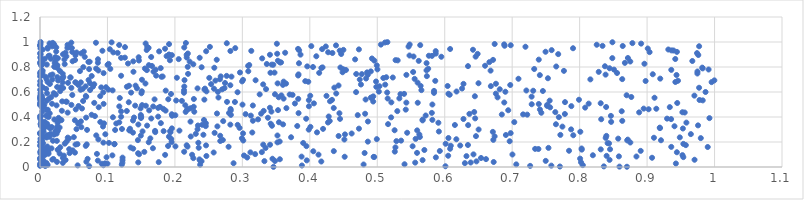
| Category | Series 0 |
|---|---|
| 0.34609850408157483 | 0.001 |
| 0.8701230169537172 | 0.002 |
| 0.8590746263405716 | 0.003 |
| 0.7707191763916836 | 0.004 |
| 0.8358766132040387 | 0.005 |
| 0.6010607535488997 | 0.006 |
| 0.07293565448946022 | 0.007 |
| 0.00771291999905519 | 0.008 |
| 0.7266412157041429 | 0.009 |
| 1.1942616296057263e-05 | 0.01 |
| 0.7580511875135892 | 0.011 |
| 0.3882707974454156 | 0.012 |
| 0.05581828898866101 | 0.013 |
| 0.09406006677202891 | 0.014 |
| 0.8047179292772505 | 0.015 |
| 0.003863088627174636 | 0.016 |
| 0.01130017151357119 | 0.017 |
| 0.23739581231754572 | 0.018 |
| 0.12126176740894952 | 0.019 |
| 0.4797131902942096 | 0.02 |
| 0.7060762783313401 | 0.021 |
| 0.5404066484481409 | 0.022 |
| 0.0018386676906438756 | 0.023 |
| 0.005142357919705772 | 0.024 |
| 9.315736753592806e-05 | 0.025 |
| 0.09159497941963071 | 0.026 |
| 0.10002402573890022 | 0.027 |
| 0.9426883934642515 | 0.028 |
| 0.09631425108684541 | 0.029 |
| 0.2869450065328188 | 0.03 |
| 0.6298747592418918 | 0.031 |
| 0.009634052700162097 | 0.032 |
| 0.03386380016610608 | 0.033 |
| 0.12213006198934043 | 0.034 |
| 0.5562227075702795 | 0.035 |
| 0.6385126634095246 | 0.036 |
| 0.14565441430545298 | 0.037 |
| 0.8020445406044975 | 0.038 |
| 0.17603440989443436 | 0.039 |
| 0.6725695168762296 | 0.04 |
| 0.02515358011730803 | 0.041 |
| 0.06872653092047736 | 0.042 |
| 0.005001000734877526 | 0.043 |
| 0.4170150238592685 | 0.044 |
| 0.6470558440749214 | 0.045 |
| 0.23948553573883455 | 0.046 |
| 0.3326801138612933 | 0.047 |
| 0.3483039852015914 | 0.048 |
| 0.749727040892972 | 0.049 |
| 0.23739669981891307 | 0.05 |
| 0.08573642790800982 | 0.051 |
| 0.0050844624076101415 | 0.052 |
| 0.39545073359539806 | 0.053 |
| 0.12232785085866753 | 0.054 |
| 0.567184083114485 | 0.055 |
| 0.03792782334064068 | 0.056 |
| 0.8443821193558733 | 0.057 |
| 0.970344363042003 | 0.058 |
| 0.018263929062364112 | 0.059 |
| 0.0002078491798121665 | 0.06 |
| 0.23637610084465102 | 0.061 |
| 0.3555779525197878 | 0.062 |
| 0.6612224107485791 | 0.063 |
| 0.019899329452830423 | 0.064 |
| 0.07061713005036262 | 0.065 |
| 0.3446542961292698 | 0.066 |
| 0.8007031547956249 | 0.067 |
| 0.0027111332217973397 | 0.068 |
| 0.0009761094461368969 | 0.069 |
| 2.217282747861245e-06 | 0.07 |
| 0.22726643992422932 | 0.071 |
| 0.6538391295614256 | 0.072 |
| 0.033878473131424405 | 0.073 |
| 0.9073660488570621 | 0.074 |
| 0.12237888075237903 | 0.075 |
| 0.30718309983009245 | 0.076 |
| 0.5868591995673863 | 0.077 |
| 0.09867170390908793 | 0.078 |
| 0.9537196063433162 | 0.079 |
| 0.4954651481825387 | 0.08 |
| 0.49463863612927106 | 0.081 |
| 0.45167173284663703 | 0.082 |
| 0.3877857817559414 | 0.083 |
| 0.8842214962436343 | 0.084 |
| 0.8581959821748041 | 0.085 |
| 0.0024866523060763225 | 0.086 |
| 0.6322340298765589 | 0.087 |
| 0.24668157246419262 | 0.088 |
| 0.8400088670649972 | 0.089 |
| 0.6051160154622663 | 0.09 |
| 0.03536148895313439 | 0.091 |
| 0.3024554383872878 | 0.092 |
| 0.10729480263548205 | 0.093 |
| 0.8196174866211832 | 0.094 |
| 0.9524343902360414 | 0.095 |
| 0.0072368965800672785 | 0.096 |
| 0.18549781271415383 | 0.097 |
| 0.2254789067246822 | 0.098 |
| 0.4128695777979794 | 0.099 |
| 0.7003798539905738 | 0.1 |
| 0.6426288253663484 | 0.101 |
| 0.14697462826221633 | 0.102 |
| 0.3189875935034514 | 0.103 |
| 0.0020687035044975855 | 0.104 |
| 0.08440831731598081 | 0.105 |
| 0.012571795168483588 | 0.106 |
| 0.0292068193292072 | 0.107 |
| 0.009062133623295516 | 0.108 |
| 0.0007167533508876055 | 0.109 |
| 0.1454113684133526 | 0.11 |
| 0.0438724239287738 | 0.111 |
| 0.4812385304832297 | 0.112 |
| 0.5589462784256256 | 0.113 |
| 0.012267878290702756 | 0.114 |
| 0.051820088517687296 | 0.115 |
| 0.25747481049224435 | 0.116 |
| 0.3119596891810316 | 0.117 |
| 0.9441618830176376 | 0.118 |
| 0.32889085168017557 | 0.119 |
| 0.0005091550194783028 | 0.12 |
| 0.1546633832366411 | 0.121 |
| 0.21371602462328368 | 0.122 |
| 0.525997482557602 | 0.123 |
| 0.009524539337488458 | 0.124 |
| 0.000889873601262781 | 0.125 |
| 0.40516804132315376 | 0.126 |
| 0.4355428114707357 | 0.127 |
| 0.5927151085216991 | 0.128 |
| 0.8905290691563017 | 0.129 |
| 0.7842803136689592 | 0.13 |
| 0.003010949885408159 | 0.131 |
| 0.011870787345475921 | 0.132 |
| 0.04845034880724805 | 0.133 |
| 0.012037415338428057 | 0.134 |
| 0.006146116607534695 | 0.135 |
| 0.5698178809231982 | 0.136 |
| 0.02631663378469189 | 0.137 |
| 0.001652901663402185 | 0.138 |
| 0.8031206051380175 | 0.139 |
| 0.027236332366496432 | 0.14 |
| 0.8313149584107221 | 0.141 |
| 0.8450949416081099 | 0.142 |
| 0.043283143471134565 | 0.143 |
| 0.7389028242029545 | 0.144 |
| 0.7340241031608948 | 0.145 |
| 0.6079969873923393 | 0.146 |
| 0.13818208685357267 | 0.147 |
| 0.8028915738352964 | 0.148 |
| 0.017077539601003233 | 0.149 |
| 0.16739616353151096 | 0.15 |
| 0.003020604731091785 | 0.151 |
| 0.3343776795671446 | 0.152 |
| 0.7537999835714145 | 0.153 |
| 0.23530548479117172 | 0.154 |
| 0.00975895863699269 | 0.155 |
| 0.13434474549654407 | 0.156 |
| 0.5269246126182355 | 0.157 |
| 0.03001518724002015 | 0.158 |
| 0.0029468920668668207 | 0.159 |
| 0.989887429713849 | 0.16 |
| 0.9358524139497696 | 0.161 |
| 0.27956423026020694 | 0.162 |
| 0.21868327953006905 | 0.163 |
| 0.011008283891728707 | 0.164 |
| 0.2007723238303978 | 0.165 |
| 0.5523963542140804 | 0.166 |
| 0.39490249344681944 | 0.167 |
| 0.18987421186689984 | 0.168 |
| 0.06786084650052786 | 0.169 |
| 0.6089907129545684 | 0.17 |
| 1.464148654706145e-05 | 0.171 |
| 0.6230002769719323 | 0.172 |
| 0.24617427616714285 | 0.173 |
| 0.2174346158828126 | 0.174 |
| 0.9574424837876597 | 0.175 |
| 0.6344037776264848 | 0.176 |
| 0.0027314434497757814 | 0.177 |
| 0.3410623511799116 | 0.178 |
| 0.33096896281635163 | 0.179 |
| 0.052660394494633535 | 0.18 |
| 0.06926060897871843 | 0.181 |
| 0.11023575705453699 | 0.182 |
| 0.055573490319121704 | 0.183 |
| 0.11049421290138632 | 0.184 |
| 0.9537584422316584 | 0.185 |
| 0.6013793258636954 | 0.186 |
| 0.03678596251341063 | 0.187 |
| 0.0015231063217676969 | 0.188 |
| 0.8436216750388169 | 0.189 |
| 0.004544852791203699 | 0.19 |
| 0.8414890374806338 | 0.191 |
| 0.3901970115116386 | 0.192 |
| 0.10216104457395644 | 0.193 |
| 0.23473445870153734 | 0.194 |
| 0.09398144210774691 | 0.195 |
| 0.875159409648524 | 0.196 |
| 0.3519900267928854 | 0.197 |
| 0.1611832608612091 | 0.198 |
| 0.19505941897767515 | 0.199 |
| 0.00022198447347669738 | 0.2 |
| 0.00307384163797535 | 0.201 |
| 0.0017536033320144817 | 0.202 |
| 0.4860000531269516 | 0.203 |
| 0.3553298145342922 | 0.204 |
| 0.039622312370843064 | 0.205 |
| 0.6962809165458379 | 0.206 |
| 0.5283522959034039 | 0.207 |
| 0.26726784861248953 | 0.208 |
| 0.024984332431647025 | 0.209 |
| 0.019164628914755517 | 0.21 |
| 0.5353355721142317 | 0.211 |
| 0.30134305658465116 | 0.212 |
| 0.8706151910249356 | 0.213 |
| 0.9206087634921669 | 0.214 |
| 0.1451440588475067 | 0.215 |
| 0.27103346544748985 | 0.216 |
| 0.6720563527396854 | 0.217 |
| 0.0031701336963966013 | 0.218 |
| 0.8713169534977834 | 0.219 |
| 0.4512435796519784 | 0.22 |
| 0.08654004582760928 | 0.221 |
| 0.6172185434925063 | 0.222 |
| 0.49932018245078363 | 0.223 |
| 0.19456774972707805 | 0.224 |
| 0.5568477748578525 | 0.225 |
| 0.0007086004685260103 | 0.226 |
| 0.8571979591816551 | 0.227 |
| 0.042868775146559235 | 0.228 |
| 0.16357235559108482 | 0.229 |
| 0.299332994543188 | 0.23 |
| 0.9796115124790612 | 0.231 |
| 0.6054807309600239 | 0.232 |
| 0.8386287802585576 | 0.233 |
| 0.910160581730461 | 0.234 |
| 0.04115666628761399 | 0.235 |
| 0.009758138327668316 | 0.236 |
| 0.9484896271221718 | 0.237 |
| 0.37223772641407626 | 0.238 |
| 0.05015876867485652 | 0.239 |
| 0.5631381363500125 | 0.24 |
| 0.014066399073711797 | 0.241 |
| 0.009598419545507334 | 0.242 |
| 0.19116727641995288 | 0.243 |
| 0.22350399835410914 | 0.244 |
| 0.673991687000459 | 0.245 |
| 0.00502068661396412 | 0.246 |
| 0.6463312001788859 | 0.247 |
| 0.4426829348365701 | 0.248 |
| 0.8396016495296093 | 0.249 |
| 0.26712197616822597 | 0.25 |
| 0.14947821458007932 | 0.251 |
| 0.3520262701853294 | 0.252 |
| 0.08341794932494594 | 0.253 |
| 0.7905731425602177 | 0.254 |
| 0.01097936709016645 | 0.255 |
| 0.6906661974335426 | 0.256 |
| 0.7714257528402756 | 0.257 |
| 0.24222493811552692 | 0.258 |
| 0.02090442577155256 | 0.259 |
| 0.5623554041738894 | 0.26 |
| 0.45209498355965994 | 0.261 |
| 0.09684790008058379 | 0.262 |
| 0.9648727745274231 | 0.263 |
| 0.0004112416076640618 | 0.264 |
| 0.23097149705830583 | 0.265 |
| 0.015610332130006392 | 0.266 |
| 0.024656368962216495 | 0.267 |
| 0.46202046513060513 | 0.268 |
| 0.30102094623632253 | 0.269 |
| 0.0007755927309659283 | 0.27 |
| 0.6977672042211963 | 0.271 |
| 5.5858426602499385e-05 | 0.272 |
| 0.2588486989551675 | 0.273 |
| 0.5443051893748219 | 0.274 |
| 0.13783575670896575 | 0.275 |
| 0.3147014083282587 | 0.276 |
| 0.41065268297629925 | 0.277 |
| 0.19347331483568994 | 0.278 |
| 0.17084621986100287 | 0.279 |
| 0.02459849242481436 | 0.28 |
| 0.671330048879794 | 0.281 |
| 0.8010230268304595 | 0.282 |
| 0.005347456244570323 | 0.283 |
| 0.5913165928157248 | 0.284 |
| 0.15204522771267823 | 0.285 |
| 0.022652676772864245 | 0.286 |
| 0.1832968909260748 | 0.287 |
| 0.19298211021650635 | 0.288 |
| 0.17055251760561219 | 0.289 |
| 0.026576107139603865 | 0.29 |
| 0.20670498400529524 | 0.291 |
| 0.1329308133586653 | 0.292 |
| 0.5591688973420827 | 0.293 |
| 0.5256878622288561 | 0.294 |
| 0.13236763589643938 | 0.295 |
| 0.11136424609788886 | 0.296 |
| 0.06976888565529421 | 0.297 |
| 0.003950693259211389 | 0.298 |
| 0.39839261486381977 | 0.299 |
| 0.6502602798090451 | 0.3 |
| 0.787375008907539 | 0.301 |
| 0.23357101044235004 | 0.302 |
| 0.05408020884572965 | 0.303 |
| 0.12150156766089905 | 0.304 |
| 0.41962603825177225 | 0.305 |
| 0.13340801508576386 | 0.306 |
| 0.4728472874970122 | 0.307 |
| 0.9530804143953012 | 0.308 |
| 0.19552779398953307 | 0.309 |
| 0.014865908388145048 | 0.31 |
| 0.9191456835399817 | 0.311 |
| 0.005820850066488295 | 0.312 |
| 0.295815657141978 | 0.313 |
| 0.015746149071602992 | 0.314 |
| 0.9187720118422132 | 0.315 |
| 0.02908479164740589 | 0.316 |
| 0.0067748014492864305 | 0.317 |
| 0.02480333065957342 | 0.318 |
| 0.06127245786417292 | 0.319 |
| 0.017142158121418172 | 0.32 |
| 0.40093364981056795 | 0.321 |
| 0.012598667547227315 | 0.322 |
| 0.774454342836116 | 0.323 |
| 0.09337631726295957 | 0.324 |
| 0.2629918719152651 | 0.325 |
| 0.9406164725016677 | 0.326 |
| 0.24571139550957463 | 0.327 |
| 0.3813792342354057 | 0.328 |
| 0.0013160730642777316 | 0.329 |
| 0.3438896028361963 | 0.33 |
| 0.15880211690300475 | 0.331 |
| 0.23412435147880165 | 0.332 |
| 0.975520917876621 | 0.333 |
| 0.002822990302092179 | 0.334 |
| 0.6347090782841476 | 0.335 |
| 0.6150744698368191 | 0.336 |
| 0.29300821399314386 | 0.337 |
| 0.24045961892165385 | 0.338 |
| 0.28216065725580575 | 0.339 |
| 0.14576808091149934 | 0.34 |
| 0.360350759661091 | 0.341 |
| 0.7648822292267519 | 0.342 |
| 0.5159975713699013 | 0.343 |
| 0.0007776602550131516 | 0.344 |
| 0.01063822118059167 | 0.345 |
| 0.34205041978566897 | 0.346 |
| 0.05658384981588535 | 0.347 |
| 0.1130863061271067 | 0.348 |
| 0.09492574469343577 | 0.349 |
| 0.24593497640420556 | 0.35 |
| 0.17915649936023206 | 0.351 |
| 0.057349405964428654 | 0.352 |
| 0.026088680789117576 | 0.353 |
| 0.5905751248688176 | 0.354 |
| 0.9582797693857213 | 0.355 |
| 0.42695229209436464 | 0.356 |
| 0.11751569704687899 | 0.357 |
| 0.3542040448153611 | 0.358 |
| 0.703115485243932 | 0.359 |
| 0.08939237719586854 | 0.36 |
| 0.8467323353988893 | 0.361 |
| 0.006998284140220014 | 0.362 |
| 0.22312987643144983 | 0.363 |
| 0.48612811304198533 | 0.364 |
| 0.06063066595191476 | 0.365 |
| 0.0016752367119302377 | 0.366 |
| 0.27161236020284957 | 0.367 |
| 0.4294887631167065 | 0.368 |
| 0.8631950204182515 | 0.369 |
| 0.3156149189558541 | 0.37 |
| 0.025759308753822336 | 0.371 |
| 0.13787646890397273 | 0.372 |
| 0.5671658009886011 | 0.373 |
| 0.05173561997182909 | 0.374 |
| 0.0317826019513538 | 0.375 |
| 0.2431080849833922 | 0.376 |
| 0.581636847684222 | 0.377 |
| 0.03013855689331374 | 0.378 |
| 0.5672603072678 | 0.379 |
| 0.02126276322527 | 0.38 |
| 0.32327337083081475 | 0.381 |
| 0.8319874578240807 | 0.382 |
| 0.9356037292439521 | 0.383 |
| 0.6278051489209643 | 0.384 |
| 0.4448051486278761 | 0.385 |
| 0.39462686890583865 | 0.386 |
| 0.9296053744177276 | 0.387 |
| 0.16494432077222024 | 0.388 |
| 0.6451523864364053 | 0.389 |
| 0.00027671579202603506 | 0.39 |
| 0.992441598070824 | 0.391 |
| 0.1497460230772881 | 0.392 |
| 0.027668554536989725 | 0.393 |
| 0.337899618780583 | 0.394 |
| 0.0683875027241188 | 0.395 |
| 0.1393850430265561 | 0.396 |
| 0.5205648061704106 | 0.397 |
| 0.10810045807617684 | 0.398 |
| 0.769191767618975 | 0.399 |
| 0.012675961593519865 | 0.4 |
| 0.15000054563110216 | 0.401 |
| 0.12024867858515169 | 0.402 |
| 0.17519056933902186 | 0.403 |
| 0.42801090419131904 | 0.404 |
| 0.010505702629349915 | 0.405 |
| 2.598601601968229e-05 | 0.406 |
| 0.08146873166276071 | 0.407 |
| 0.0016433888676747048 | 0.408 |
| 0.8463654880840058 | 0.409 |
| 0.19584393565482985 | 0.41 |
| 0.31255510625608374 | 0.411 |
| 0.5717793276111011 | 0.412 |
| 0.009314112818869857 | 0.413 |
| 0.20066031373545556 | 0.414 |
| 0.4710516543263786 | 0.415 |
| 0.14945013747121785 | 0.416 |
| 0.2829485304920725 | 0.417 |
| 0.07653423459286134 | 0.418 |
| 0.722316462866826 | 0.419 |
| 0.6846248388910127 | 0.42 |
| 0.7161870463560194 | 0.421 |
| 0.19536250232195934 | 0.422 |
| 0.30479388296115517 | 0.423 |
| 0.7781099894493159 | 0.424 |
| 0.6366029797944464 | 0.425 |
| 0.481965598719871 | 0.426 |
| 0.3278257897822405 | 0.427 |
| 0.26237443322348786 | 0.428 |
| 0.014414256677011999 | 0.429 |
| 0.44388773378754964 | 0.43 |
| 0.3833291374728593 | 0.431 |
| 0.28029498180940815 | 0.432 |
| 0.5808922484250152 | 0.433 |
| 0.7431848736744976 | 0.434 |
| 0.04098300151926024 | 0.435 |
| 0.955764747499725 | 0.436 |
| 0.8882453691052614 | 0.437 |
| 0.952313781813746 | 0.438 |
| 0.7639240917627907 | 0.439 |
| 0.6436989460834228 | 0.44 |
| 0.2159588554745163 | 0.441 |
| 0.22868754023642324 | 0.442 |
| 0.34306186148145607 | 0.443 |
| 0.0033201320813018723 | 0.444 |
| 0.12026230275294511 | 0.445 |
| 0.8623750458316373 | 0.446 |
| 0.5297052966562624 | 0.447 |
| 0.1286911761059658 | 0.448 |
| 0.3316094850480762 | 0.449 |
| 0.03240961118830298 | 0.45 |
| 0.1862033970893037 | 0.451 |
| 0.28275942828993694 | 0.452 |
| 0.161855959292946 | 0.453 |
| 0.6941250472396868 | 0.454 |
| 0.3528889545352061 | 0.455 |
| 0.009879291315666668 | 0.456 |
| 0.21784789755531098 | 0.457 |
| 0.011529253661118876 | 0.458 |
| 0.5422103318203301 | 0.459 |
| 0.7411019084324727 | 0.46 |
| 0.05304336021399901 | 0.461 |
| 0.9022854711007491 | 0.462 |
| 0.21959907760765318 | 0.463 |
| 0.2825607894132018 | 0.464 |
| 0.1828065840543102 | 0.465 |
| 0.9136806761927413 | 0.466 |
| 0.8949597590752798 | 0.467 |
| 0.06225346958118792 | 0.468 |
| 0.14907853450567915 | 0.469 |
| 0.22315933631599402 | 0.47 |
| 0.3652866046067013 | 0.471 |
| 0.43548134302499836 | 0.472 |
| 0.17504579545332116 | 0.473 |
| 0.3408353101775373 | 0.474 |
| 0.8082109754070734 | 0.475 |
| 0.0029915857214157853 | 0.476 |
| 0.7562895727698283 | 0.477 |
| 0.08709464919225499 | 0.478 |
| 0.9336513186058671 | 0.479 |
| 0.8392970013200978 | 0.48 |
| 0.17783160605159629 | 0.481 |
| 0.22789654570604373 | 0.482 |
| 0.005768461218012564 | 0.483 |
| 0.16784316711435418 | 0.484 |
| 0.11758055516842768 | 0.485 |
| 0.3986802895040067 | 0.486 |
| 0.7876970385047161 | 0.487 |
| 0.057124746373637604 | 0.488 |
| 0.7517206031361439 | 0.489 |
| 0.15691998126210288 | 0.49 |
| 0.14112952876465534 | 0.491 |
| 0.3155255284035422 | 0.492 |
| 0.024552733965341605 | 0.493 |
| 0.21539109160533534 | 0.494 |
| 0.15132842421915596 | 0.495 |
| 2.2938632300271076e-06 | 0.496 |
| 0.04656985675447961 | 0.497 |
| 0.7521069541546321 | 0.498 |
| 0.30019991451475203 | 0.499 |
| 0.5816742948871233 | 0.5 |
| 0.00654252501142814 | 0.501 |
| 0.7289691583671674 | 0.502 |
| 0.0038592139297690354 | 0.503 |
| 0.7394164589496496 | 0.504 |
| 0.09428740799721375 | 0.505 |
| 0.017779490505910794 | 0.506 |
| 0.8133927504911799 | 0.507 |
| 0.37790873350055687 | 0.508 |
| 0.40605887227683296 | 0.509 |
| 0.8312362768842158 | 0.51 |
| 3.8198102066766594e-05 | 0.511 |
| 0.9446935362389339 | 0.512 |
| 0.08040699116536604 | 0.513 |
| 0.5599963760106395 | 0.514 |
| 0.5431112501568335 | 0.515 |
| 0.6882626693457725 | 0.516 |
| 0.5208510862203467 | 0.517 |
| 0.13158731114658476 | 0.518 |
| 0.7783227618614762 | 0.519 |
| 0.28896793823742617 | 0.52 |
| 0.2772484431001666 | 0.521 |
| 0.03956407004118656 | 0.522 |
| 0.038626677266121574 | 0.523 |
| 0.493985979139989 | 0.524 |
| 0.03288714094043781 | 0.525 |
| 0.42995323748010816 | 0.526 |
| 0.001694178399432503 | 0.527 |
| 0.06391058690423641 | 0.528 |
| 0.21037696219703145 | 0.529 |
| 0.009865650011558657 | 0.53 |
| 0.7555855769059507 | 0.531 |
| 0.20186307549601112 | 0.532 |
| 0.9824749362564464 | 0.533 |
| 0.0003849319749205124 | 0.534 |
| 0.39854969302244286 | 0.535 |
| 0.9777490730738875 | 0.536 |
| 0.43287721110198213 | 0.537 |
| 0.7989906659329897 | 0.538 |
| 0.2436512549755009 | 0.539 |
| 0.48272098062971885 | 0.54 |
| 0.16984758617123366 | 0.541 |
| 0.19018159867738005 | 0.542 |
| 0.00396046292899245 | 0.543 |
| 0.22808366282482148 | 0.544 |
| 0.3828143277095334 | 0.545 |
| 0.013246303085096289 | 0.546 |
| 0.36111930147286486 | 0.547 |
| 0.5154034600624807 | 0.548 |
| 0.5327488928111477 | 0.549 |
| 0.00020774054171599356 | 0.55 |
| 0.00017687278119891966 | 0.551 |
| 0.11827013202323843 | 0.552 |
| 0.4916770286990234 | 0.553 |
| 0.911009669371061 | 0.554 |
| 0.4904241685664868 | 0.555 |
| 0.26456431206580405 | 0.556 |
| 0.6783580239076032 | 0.557 |
| 0.35385470463287905 | 0.558 |
| 0.01662781057284491 | 0.559 |
| 0.8766030604148927 | 0.56 |
| 0.0002100873979154269 | 0.561 |
| 0.06857585511204697 | 0.562 |
| 0.7288281738927059 | 0.563 |
| 0.00323879829097526 | 0.564 |
| 0.4940815323246945 | 0.565 |
| 0.6446963111684835 | 0.566 |
| 0.08929874079500077 | 0.567 |
| 0.06794444412418993 | 0.568 |
| 0.42472506877279137 | 0.569 |
| 0.40062741062634893 | 0.57 |
| 0.970134999346753 | 0.571 |
| 0.0006734948904758887 | 0.572 |
| 0.35785770731034183 | 0.573 |
| 0.869647975354691 | 0.574 |
| 0.0011687396979471693 | 0.575 |
| 0.047884938510550916 | 0.576 |
| 0.3743852767794316 | 0.577 |
| 0.6073876095962418 | 0.578 |
| 0.023384809844054114 | 0.579 |
| 0.37013387091119976 | 0.58 |
| 0.3256779254970464 | 0.581 |
| 0.34833879772729165 | 0.582 |
| 0.5343592073853994 | 0.583 |
| 0.19421814920266592 | 0.584 |
| 0.5397696541800482 | 0.585 |
| 0.6054989881259437 | 0.586 |
| 0.6758062923793181 | 0.587 |
| 0.4391961308918188 | 0.588 |
| 0.010472956074096661 | 0.589 |
| 0.15035014021316562 | 0.59 |
| 0.020413590128689377 | 0.591 |
| 0.0008086527788342932 | 0.592 |
| 0.5840995896997563 | 0.593 |
| 0.21346676166705886 | 0.594 |
| 0.13505914097769078 | 0.595 |
| 0.5147028167829883 | 0.596 |
| 0.0937955952483466 | 0.597 |
| 0.2928372872841743 | 0.598 |
| 0.46857982658636077 | 0.599 |
| 0.9866527461487906 | 0.6 |
| 0.26366355169492045 | 0.601 |
| 0.6898885901309063 | 0.602 |
| 0.5023380859507168 | 0.603 |
| 0.6174979238277074 | 0.604 |
| 0.24680193630551292 | 0.605 |
| 0.15094659306635183 | 0.606 |
| 0.02991226275996935 | 0.607 |
| 0.7455089105757161 | 0.608 |
| 0.5841624682748511 | 0.609 |
| 0.7311739587932529 | 0.61 |
| 0.18637486193242359 | 0.611 |
| 0.7210388165858536 | 0.612 |
| 0.10766135629381716 | 0.613 |
| 0.21350072861083735 | 0.614 |
| 0.5654221687734409 | 0.615 |
| 0.07424598038093838 | 0.616 |
| 0.0002447132114371452 | 0.617 |
| 0.060176231981793886 | 0.618 |
| 0.10133720546868615 | 0.619 |
| 0.24378598175814636 | 0.62 |
| 0.26996160994242 | 0.621 |
| 0.6815788036299818 | 0.622 |
| 0.33511032325450174 | 0.623 |
| 0.009109991497766576 | 0.624 |
| 0.06335764971492988 | 0.625 |
| 0.25794626769778023 | 0.626 |
| 0.24454134046076575 | 0.627 |
| 0.62566737357541 | 0.628 |
| 0.23353400644016822 | 0.629 |
| 0.14376080312892042 | 0.63 |
| 0.2735517495978553 | 0.631 |
| 0.034296790616828166 | 0.632 |
| 0.046487267028734035 | 0.633 |
| 0.9770895897712951 | 0.634 |
| 0.43639543762561833 | 0.635 |
| 0.004335076786994033 | 0.636 |
| 0.09081356686004245 | 0.637 |
| 0.0978381354310214 | 0.638 |
| 0.030892997507379054 | 0.639 |
| 0.025426692403973005 | 0.64 |
| 0.49859796887932645 | 0.641 |
| 0.1288053086732029 | 0.642 |
| 0.07857188251892507 | 0.643 |
| 0.21391034841968692 | 0.644 |
| 0.06760468812955932 | 0.645 |
| 0.5032734868941463 | 0.646 |
| 0.6683822516232122 | 0.647 |
| 0.6042963839775282 | 0.648 |
| 0.5642694106723293 | 0.649 |
| 0.13195186315917298 | 0.65 |
| 0.14169560804663828 | 0.651 |
| 0.4425597712020614 | 0.652 |
| 0.0006172309382136029 | 0.653 |
| 0.2821626222588577 | 0.654 |
| 0.05704538009222353 | 0.655 |
| 0.6971482360180251 | 0.656 |
| 0.36013172554529715 | 0.657 |
| 0.00020279573534536473 | 0.658 |
| 0.5117880605196565 | 0.659 |
| 0.47579781354013245 | 0.66 |
| 0.3308449941260742 | 0.661 |
| 0.08039563459839696 | 0.662 |
| 0.2536721818126387 | 0.663 |
| 0.01461783565104725 | 0.664 |
| 0.6278270847769256 | 0.665 |
| 0.6759194695373972 | 0.666 |
| 0.3647425800576503 | 0.667 |
| 0.15631802747023504 | 0.668 |
| 0.35224193654217767 | 0.669 |
| 0.6500638574013049 | 0.67 |
| 0.07412443863206887 | 0.671 |
| 0.27432186312599544 | 0.672 |
| 0.04151393286976016 | 0.673 |
| 0.05339037157056955 | 0.674 |
| 0.5597914795536473 | 0.675 |
| 0.03359271164842209 | 0.676 |
| 0.060539903064649854 | 0.677 |
| 0.05231767009897498 | 0.678 |
| 0.9956753269727434 | 0.679 |
| 0.9419165289369145 | 0.68 |
| 0.011164875446582968 | 0.681 |
| 0.3977192273052235 | 0.682 |
| 0.36115973632767706 | 0.683 |
| 0.49816101334326934 | 0.684 |
| 0.29958471778819823 | 0.685 |
| 0.0003071194582819166 | 0.686 |
| 0.3932716547873508 | 0.687 |
| 0.897822663080544 | 0.688 |
| 0.5859814600726795 | 0.689 |
| 0.9457897332798898 | 0.69 |
| 0.26006960483462416 | 0.691 |
| 0.026898654988862084 | 0.692 |
| 0.9997121845402549 | 0.693 |
| 0.3196128701849403 | 0.694 |
| 0.2142450774756446 | 0.695 |
| 0.0720042604107797 | 0.696 |
| 0.30097248408530763 | 0.697 |
| 0.15116184546584338 | 0.698 |
| 0.018237122273240886 | 0.699 |
| 0.4740327677013597 | 0.7 |
| 0.8159219605222242 | 0.701 |
| 0.2667385000122424 | 0.702 |
| 0.8631422345878451 | 0.703 |
| 0.009554697361309566 | 0.704 |
| 0.5554103286522416 | 0.705 |
| 0.7093328968241938 | 0.706 |
| 0.9194851985071121 | 0.707 |
| 0.48341163025403866 | 0.708 |
| 0.03336651148696346 | 0.709 |
| 0.7529754359434674 | 0.71 |
| 0.033054188724823734 | 0.711 |
| 0.5089596419282532 | 0.712 |
| 0.2509508195041834 | 0.713 |
| 0.20292934036466148 | 0.714 |
| 0.045263072248113004 | 0.715 |
| 0.523014033699114 | 0.716 |
| 0.04499940832324548 | 0.717 |
| 0.5133700712071056 | 0.718 |
| 0.025700297057902922 | 0.719 |
| 0.008519882212546721 | 0.72 |
| 0.034528413261150304 | 0.721 |
| 0.18001354985977433 | 0.722 |
| 0.28384539064330067 | 0.723 |
| 0.18186593391058664 | 0.724 |
| 0.2679424038769217 | 0.725 |
| 0.00015592952960498591 | 0.726 |
| 0.5735133090517968 | 0.727 |
| 0.0766468427076073 | 0.728 |
| 0.27673960076293846 | 0.729 |
| 0.12023003169779316 | 0.73 |
| 0.17216344999484698 | 0.731 |
| 0.3827352302352017 | 0.732 |
| 0.0028187442989240172 | 0.733 |
| 0.015521180767480906 | 0.734 |
| 0.7409927228671869 | 0.735 |
| 0.9436208545769409 | 0.736 |
| 0.5431604807303815 | 0.737 |
| 0.4859354082943409 | 0.738 |
| 0.8384803551049632 | 0.739 |
| 0.01858679841353704 | 0.74 |
| 0.38323756569424744 | 0.741 |
| 0.9084216057743646 | 0.742 |
| 0.4771141338558506 | 0.743 |
| 0.46882585310326746 | 0.744 |
| 0.21948500112753136 | 0.745 |
| 0.033706278215447756 | 0.746 |
| 0.0002846431778776975 | 0.747 |
| 0.9745637694575813 | 0.748 |
| 0.0009017856561885628 | 0.749 |
| 0.0036832985320862017 | 0.75 |
| 0.0942967383851653 | 0.751 |
| 0.8554496474565039 | 0.752 |
| 0.41388756784676783 | 0.753 |
| 0.34166277635606596 | 0.754 |
| 0.34766146839261003 | 0.755 |
| 0.29645937246095877 | 0.756 |
| 0.4848722283126025 | 0.757 |
| 0.4485373264280668 | 0.758 |
| 0.0005125239499858032 | 0.759 |
| 0.5531810806620656 | 0.76 |
| 0.8283072024061 | 0.761 |
| 0.13854705259960767 | 0.762 |
| 0.168265019879204 | 0.763 |
| 0.9746764512804663 | 0.764 |
| 0.49044067925957097 | 0.765 |
| 0.30875301052275705 | 0.766 |
| 0.059231244992707446 | 0.767 |
| 0.02954770960274806 | 0.768 |
| 0.7767139044415444 | 0.769 |
| 0.003970386881850794 | 0.77 |
| 0.6679837425924339 | 0.771 |
| 0.0865113349386377 | 0.772 |
| 0.5730075740670174 | 0.773 |
| 0.0027873054444880196 | 0.774 |
| 0.15844841701547496 | 0.775 |
| 0.45355876001725104 | 0.776 |
| 0.9358726654749384 | 0.777 |
| 0.17137790351988352 | 0.778 |
| 0.8509522958126646 | 0.779 |
| 0.9911685565541177 | 0.78 |
| 0.5002104784477612 | 0.781 |
| 0.4494308846297998 | 0.782 |
| 0.07285474300376595 | 0.783 |
| 0.7326839704777495 | 0.784 |
| 0.10422556759905666 | 0.785 |
| 0.575477173411366 | 0.786 |
| 0.08321774951336801 | 0.787 |
| 0.155520093399213 | 0.788 |
| 0.9823889602754365 | 0.789 |
| 0.8443140470437953 | 0.79 |
| 0.17894820232314837 | 0.791 |
| 0.41711843461995896 | 0.792 |
| 0.02558863113922523 | 0.793 |
| 0.25841854677522186 | 0.794 |
| 0.981816797649664 | 0.795 |
| 0.4453561514031692 | 0.796 |
| 0.41885341926933967 | 0.797 |
| 0.23960849803460937 | 0.798 |
| 0.06419628541539758 | 0.799 |
| 0.40470420742007185 | 0.8 |
| 0.21899903171351803 | 0.801 |
| 0.02153373600169478 | 0.802 |
| 0.021285730017618378 | 0.803 |
| 0.7653237753872237 | 0.804 |
| 0.3962316719424346 | 0.805 |
| 0.837505158916219 | 0.806 |
| 0.6345088299565769 | 0.807 |
| 0.16597074543737253 | 0.808 |
| 0.3085690099529189 | 0.809 |
| 0.6598116362326275 | 0.81 |
| 0.001822769385336673 | 0.811 |
| 0.02503527361382078 | 0.812 |
| 0.49930252824989974 | 0.813 |
| 0.025751585545121213 | 0.814 |
| 0.16134903965907735 | 0.815 |
| 0.31018602772291104 | 0.816 |
| 0.10015376004074183 | 0.817 |
| 0.34582167595130553 | 0.818 |
| 0.3434663077492632 | 0.819 |
| 0.010041894341708633 | 0.82 |
| 0.0034740057349072592 | 0.821 |
| 0.22730258847423204 | 0.822 |
| 0.03659204424428055 | 0.823 |
| 0.33625312802705254 | 0.824 |
| 0.10169060861632874 | 0.825 |
| 0.8960588682474427 | 0.826 |
| 0.0022100790825528814 | 0.827 |
| 0.1304632824073727 | 0.828 |
| 0.00021342428819474819 | 0.829 |
| 0.38390318878305335 | 0.83 |
| 0.5730726050295815 | 0.831 |
| 0.021811492045135734 | 0.832 |
| 0.8670792353252489 | 0.833 |
| 0.08583124091022776 | 0.834 |
| 0.002056971218532581 | 0.835 |
| 0.35590051907123216 | 0.836 |
| 0.3573382837327421 | 0.837 |
| 0.0002944614759591993 | 0.838 |
| 0.6662213720237625 | 0.839 |
| 0.0032909461757707702 | 0.84 |
| 0.07175826357892974 | 0.841 |
| 0.07363818304807218 | 0.842 |
| 0.22187695109354483 | 0.843 |
| 0.8750870209933319 | 0.844 |
| 0.1382675744818171 | 0.845 |
| 0.0482863943467012 | 0.846 |
| 0.022717858800587423 | 0.847 |
| 0.9670912358350605 | 0.848 |
| 0.5614702038135732 | 0.849 |
| 0.3526451059095314 | 0.85 |
| 0.49566716458524596 | 0.851 |
| 0.14665508241741831 | 0.852 |
| 0.5302466772772283 | 0.853 |
| 0.19259084108260854 | 0.854 |
| 0.5271187797038444 | 0.855 |
| 0.051980194196642814 | 0.856 |
| 0.6716606951727653 | 0.857 |
| 0.26199524309663536 | 0.858 |
| 0.7394117276959552 | 0.859 |
| 0.03613075807890115 | 0.86 |
| 0.4671577488461765 | 0.861 |
| 0.0859431452454608 | 0.862 |
| 0.20562762563621254 | 0.863 |
| 0.9417812285248308 | 0.864 |
| 0.007050655219771156 | 0.865 |
| 0.015958421869693255 | 0.866 |
| 0.0012462797855795152 | 0.867 |
| 0.4921316833415314 | 0.868 |
| 0.32936623328622294 | 0.869 |
| 0.026517461022145136 | 0.87 |
| 0.8484617862077499 | 0.871 |
| 0.8715453653345552 | 0.872 |
| 0.12021573864204536 | 0.873 |
| 0.23671199905714715 | 0.874 |
| 0.125822439155731 | 0.875 |
| 0.21750385977322748 | 0.876 |
| 0.00046256676820518824 | 0.877 |
| 0.1462876099518318 | 0.878 |
| 0.022830917529545608 | 0.879 |
| 0.1648405601863795 | 0.88 |
| 0.06634254173816984 | 0.881 |
| 0.5949614859103276 | 0.882 |
| 0.6458260312139044 | 0.883 |
| 0.5537453160269254 | 0.884 |
| 0.0390906594089947 | 0.885 |
| 0.40961864632764655 | 0.886 |
| 0.18767579244903387 | 0.887 |
| 0.01259719413675705 | 0.888 |
| 0.5810837589421501 | 0.889 |
| 0.5764375815599133 | 0.89 |
| 0.014125864688333326 | 0.891 |
| 0.547780383885891 | 0.892 |
| 0.19081817195498535 | 0.893 |
| 0.052557262744396045 | 0.894 |
| 0.19550654961307812 | 0.895 |
| 0.9759034851061763 | 0.896 |
| 0.21741179371801245 | 0.897 |
| 0.3408942831544026 | 0.898 |
| 0.38619084913445934 | 0.899 |
| 0.19125827255580574 | 0.9 |
| 0.001032916777314145 | 0.901 |
| 0.034096256895661634 | 0.902 |
| 0.7682359259768113 | 0.903 |
| 0.446539684570706 | 0.904 |
| 0.6487769285405656 | 0.905 |
| 0.351615475107984 | 0.906 |
| 0.5866497248742141 | 0.907 |
| 0.21917443399226397 | 0.908 |
| 0.061064528297177664 | 0.909 |
| 0.00014317311772117292 | 0.91 |
| 0.9740401253754087 | 0.911 |
| 0.4335097463019608 | 0.912 |
| 0.1151374504315919 | 0.913 |
| 0.36342026341849026 | 0.914 |
| 0.0378130977412833 | 0.915 |
| 0.054245725855163296 | 0.916 |
| 0.10864891386787044 | 0.917 |
| 0.4271881613540168 | 0.918 |
| 0.9037217049394581 | 0.919 |
| 0.047911661670759144 | 0.92 |
| 0.9442262650392027 | 0.921 |
| 0.7494659807928994 | 0.922 |
| 0.06494523545619003 | 0.923 |
| 0.024013617548083552 | 0.924 |
| 0.17661150791931213 | 0.925 |
| 0.24631669455773716 | 0.926 |
| 0.5866440439849161 | 0.927 |
| 0.2822731516450856 | 0.928 |
| 0.3132410580674192 | 0.929 |
| 0.09253346982612663 | 0.93 |
| 0.44429489591912613 | 0.931 |
| 0.9392177715801084 | 0.932 |
| 0.9360783843352588 | 0.933 |
| 0.3841810264045073 | 0.934 |
| 0.758531076058079 | 0.935 |
| 0.15817264361188846 | 0.936 |
| 0.44977250556438303 | 0.937 |
| 0.6418971333580652 | 0.938 |
| 0.003990480051285864 | 0.939 |
| 0.9314706878909065 | 0.94 |
| 0.4727798733332289 | 0.941 |
| 0.10357205534798182 | 0.942 |
| 0.41824193228812173 | 0.943 |
| 0.6080126665059885 | 0.944 |
| 0.3825816048482754 | 0.945 |
| 0.18538698309014529 | 0.946 |
| 0.011383724851871658 | 0.947 |
| 0.9009793862380341 | 0.948 |
| 0.0007683970051584107 | 0.949 |
| 0.790207082033363 | 0.95 |
| 0.28945468428695437 | 0.951 |
| 0.04719260543452549 | 0.952 |
| 0.1609747983711025 | 0.953 |
| 0.04058693214712274 | 0.954 |
| 0.011328067512448024 | 0.955 |
| 0.21385277911463393 | 0.956 |
| 0.02408623272048261 | 0.957 |
| 0.043093176790562536 | 0.958 |
| 0.1260126827096447 | 0.959 |
| 0.15907409318705515 | 0.96 |
| 0.25186096489176113 | 0.961 |
| 0.7196834849096875 | 0.962 |
| 0.5463736639864221 | 0.963 |
| 0.42366056256671675 | 0.964 |
| 0.01806237527440449 | 0.965 |
| 0.97713452701648 | 0.966 |
| 0.40219996946561054 | 0.967 |
| 0.863890373760018 | 0.968 |
| 0.8339022799240549 | 0.969 |
| 0.6887712737756319 | 0.97 |
| 5.4003410172430496e-05 | 0.971 |
| 0.00036961042085922326 | 0.972 |
| 0.4388146799627297 | 0.973 |
| 0.6978439374553014 | 0.974 |
| 0.5636799557580677 | 0.975 |
| 0.11738955277633355 | 0.976 |
| 0.04085789941848876 | 0.977 |
| 0.8253693137055647 | 0.978 |
| 0.5054061113027879 | 0.979 |
| 0.548042161019214 | 0.98 |
| 0.6881739442203093 | 0.981 |
| 0.020898168567923422 | 0.982 |
| 0.19132385184241957 | 0.983 |
| 0.674030590519497 | 0.984 |
| 0.0007676832077517257 | 0.985 |
| 0.35114153279543053 | 0.986 |
| 0.8912047944089828 | 0.987 |
| 0.1566198549355342 | 0.988 |
| 0.014192205297917076 | 0.989 |
| 0.2769057748105357 | 0.99 |
| 0.8782350475998496 | 0.991 |
| 0.21627058791506557 | 0.992 |
| 0.01897471475051781 | 0.993 |
| 0.08292638990314294 | 0.994 |
| 0.046416610154126535 | 0.995 |
| 0.511470084459783 | 0.996 |
| 0.10615440308117778 | 0.997 |
| 0.8485954640367444 | 0.998 |
| 0.5150045254040476 | 0.999 |
| 0.0009051311577606188 | 1 |